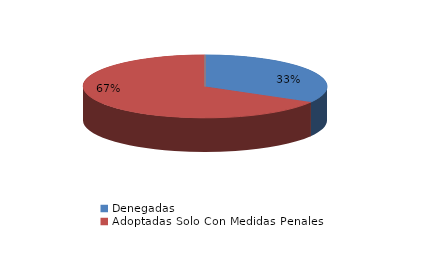
| Category | Series 0 |
|---|---|
| Denegadas | 1 |
| Adoptadas Solo Con Medidas Penales | 2 |
| Adoptadas Con Medidas Civiles Y Penales | 0 |
| Adoptadas Con Medidas Solo Civiles | 0 |